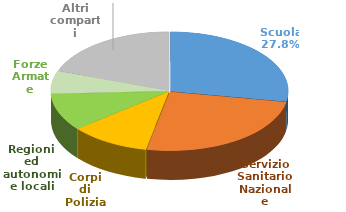
| Category | Series 0 |
|---|---|
| Scuola | 47846425764 |
| Servizio Sanitario Nazionale | 43658950802 |
| Corpi di Polizia | 18756380171 |
| Regioni ed autonomie locali | 17621788261 |
| Forze Armate | 10640706752 |
| Altri comparti | 33587906552 |